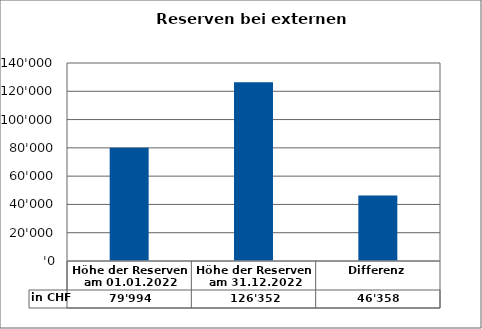
| Category | in CHF |
|---|---|
| Höhe der Reserven am 01.01.2022 | 79994 |
| Höhe der Reserven am 31.12.2022 | 126352 |
| Differenz | 46358 |